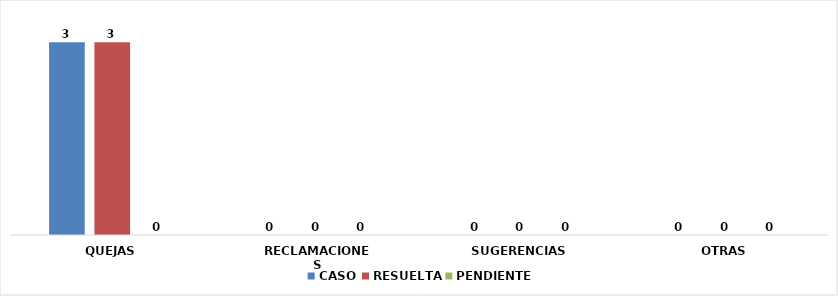
| Category | CASO | RESUELTA | PENDIENTE |
|---|---|---|---|
| QUEJAS | 3 | 3 | 0 |
| RECLAMACIONES | 0 | 0 | 0 |
| SUGERENCIAS | 0 | 0 | 0 |
| OTRAS | 0 | 0 | 0 |